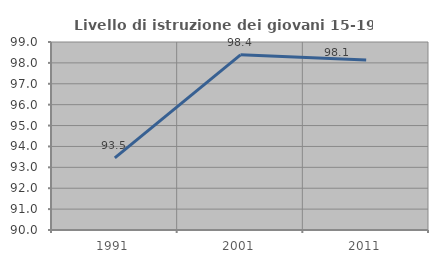
| Category | Livello di istruzione dei giovani 15-19 anni |
|---|---|
| 1991.0 | 93.456 |
| 2001.0 | 98.387 |
| 2011.0 | 98.141 |